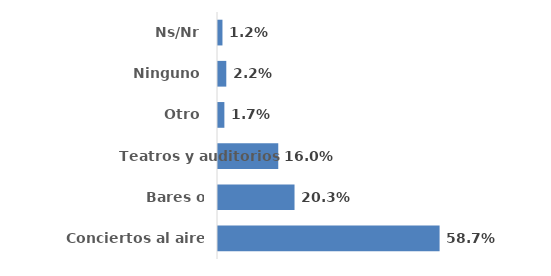
| Category | Series 0 |
|---|---|
| Conciertos al aire libre | 0.587 |
| Bares o restaurantes | 0.203 |
| Teatros y auditorios | 0.16 |
| Otro | 0.017 |
| Ninguno | 0.022 |
| Ns/Nr | 0.012 |